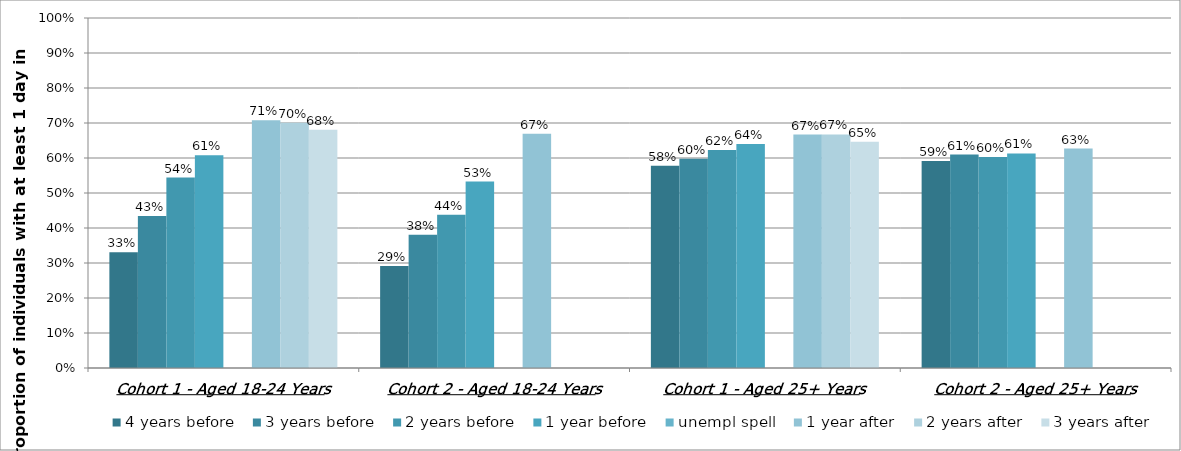
| Category | 4 years before | 3 years before | 2 years before | 1 year before | unempl spell | 1 year after | 2 years after | 3 years after |
|---|---|---|---|---|---|---|---|---|
| Cohort 1 - Aged 18-24 Years | 0.331 | 0.434 | 0.544 | 0.608 | 0 | 0.708 | 0.701 | 0.681 |
| Cohort 2 - Aged 18-24 Years | 0.292 | 0.381 | 0.438 | 0.533 | 0 | 0.67 | 0 | 0 |
| Cohort 1 - Aged 25+ Years | 0.578 | 0.598 | 0.623 | 0.64 | 0 | 0.667 | 0.667 | 0.646 |
| Cohort 2 - Aged 25+ Years | 0.592 | 0.61 | 0.603 | 0.613 | 0 | 0.627 | 0 | 0 |